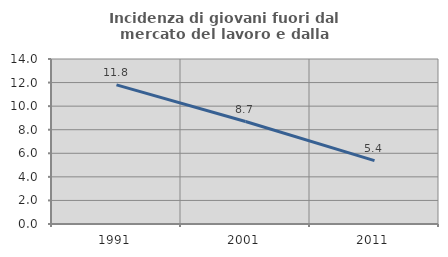
| Category | Incidenza di giovani fuori dal mercato del lavoro e dalla formazione  |
|---|---|
| 1991.0 | 11.806 |
| 2001.0 | 8.696 |
| 2011.0 | 5.376 |